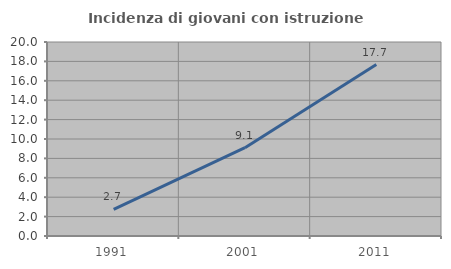
| Category | Incidenza di giovani con istruzione universitaria |
|---|---|
| 1991.0 | 2.744 |
| 2001.0 | 9.101 |
| 2011.0 | 17.675 |